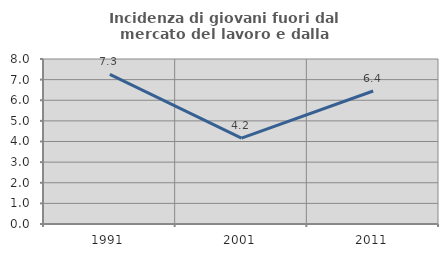
| Category | Incidenza di giovani fuori dal mercato del lavoro e dalla formazione  |
|---|---|
| 1991.0 | 7.254 |
| 2001.0 | 4.16 |
| 2011.0 | 6.449 |